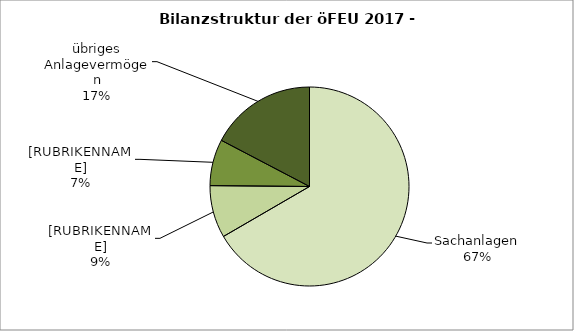
| Category | Series 0 |
|---|---|
| Sachanlagen | 66.682 |
| übriges Umlaufvermögen übrige Aktiva | 8.523 |
| Forderungen | 7.546 |
| übriges Anlagevermögen | 17.336 |